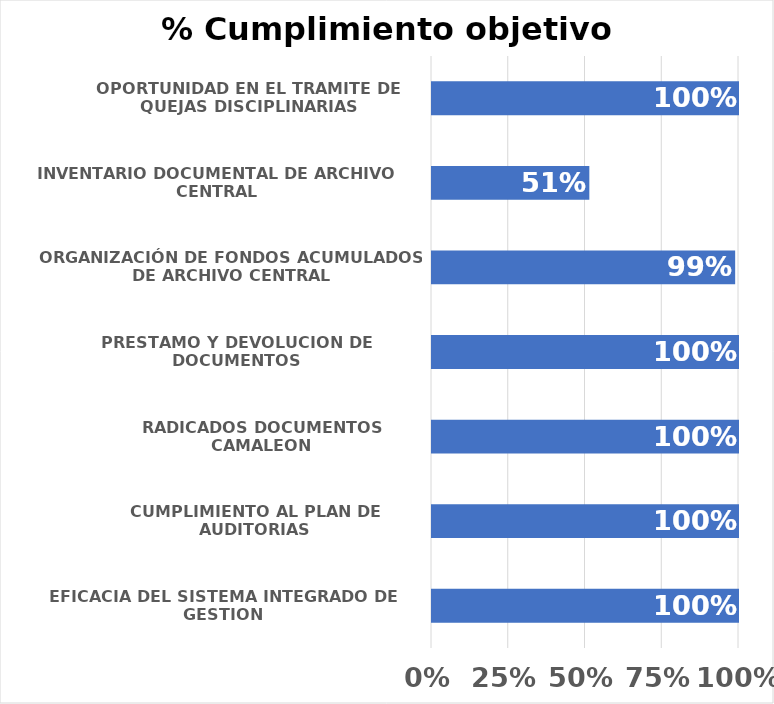
| Category | Series 0 |
|---|---|
| EFICACIA DEL SISTEMA INTEGRADO DE GESTION | 1 |
| CUMPLIMIENTO AL PLAN DE AUDITORIAS | 1 |
| RADICADOS DOCUMENTOS CAMALEON | 1 |
| PRESTAMO Y DEVOLUCION DE DOCUMENTOS | 1 |
| ORGANIZACIÓN DE FONDOS ACUMULADOS DE ARCHIVO CENTRAL | 0.987 |
| INVENTARIO DOCUMENTAL DE ARCHIVO CENTRAL | 0.513 |
| OPORTUNIDAD EN EL TRAMITE DE QUEJAS DISCIPLINARIAS | 1 |